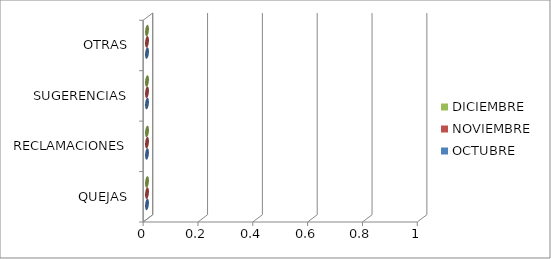
| Category | OCTUBRE | NOVIEMBRE | DICIEMBRE |
|---|---|---|---|
| QUEJAS | 0 | 0 | 0 |
| RECLAMACIONES | 0 | 0 | 0 |
| SUGERENCIAS | 0 | 0 | 0 |
| OTRAS | 0 | 0 | 0 |